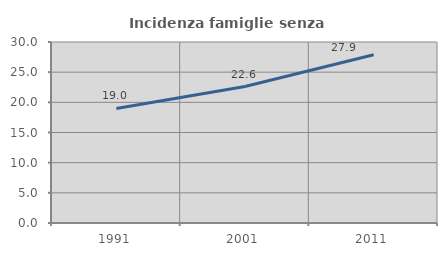
| Category | Incidenza famiglie senza nuclei |
|---|---|
| 1991.0 | 18.992 |
| 2001.0 | 22.617 |
| 2011.0 | 27.891 |